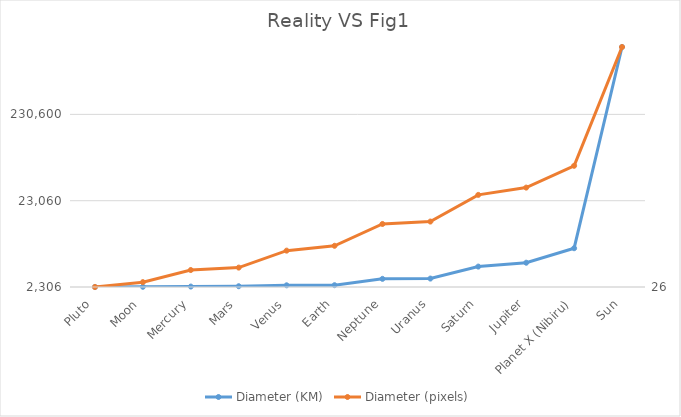
| Category | Diameter (KM) |
|---|---|
| Pluto | 2306 |
| Moon | 3473 |
| Mercury | 4880 |
| Mars | 6794 |
| Venus | 12104 |
| Earth | 12756 |
| Neptune | 49532 |
| Uranus | 51118 |
| Saturn | 120536 |
| Jupiter | 142984 |
| Planet X (Nibiru) | 226973 |
| Sun | 1392684 |